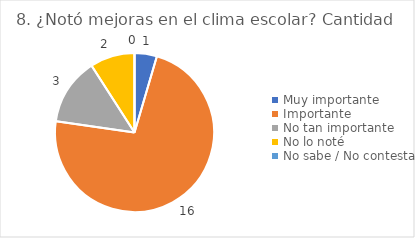
| Category | 8. ¿Notó mejoras en el clima escolar? |
|---|---|
| Muy importante  | 0.045 |
| Importante  | 0.727 |
| No tan importante  | 0.136 |
| No lo noté  | 0.091 |
| No sabe / No contesta | 0 |